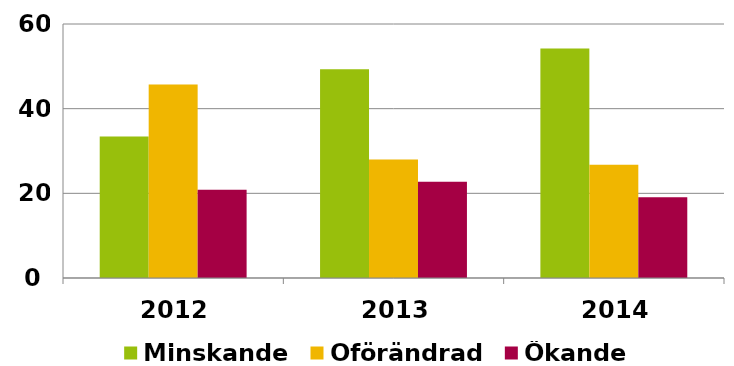
| Category | Minskande | Oförändrad | Ökande |
|---|---|---|---|
| 2012.0 | 33.45 | 45.711 | 20.839 |
| 2013.0 | 49.318 | 27.969 | 22.713 |
| 2014.0 | 54.184 | 26.75 | 19.066 |